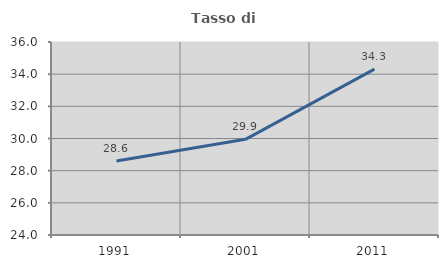
| Category | Tasso di occupazione   |
|---|---|
| 1991.0 | 28.601 |
| 2001.0 | 29.949 |
| 2011.0 | 34.315 |